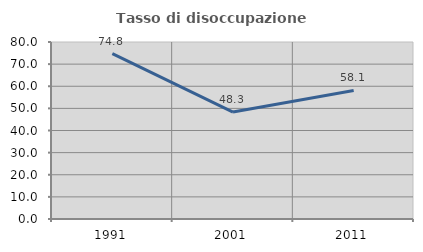
| Category | Tasso di disoccupazione giovanile  |
|---|---|
| 1991.0 | 74.782 |
| 2001.0 | 48.337 |
| 2011.0 | 58.087 |